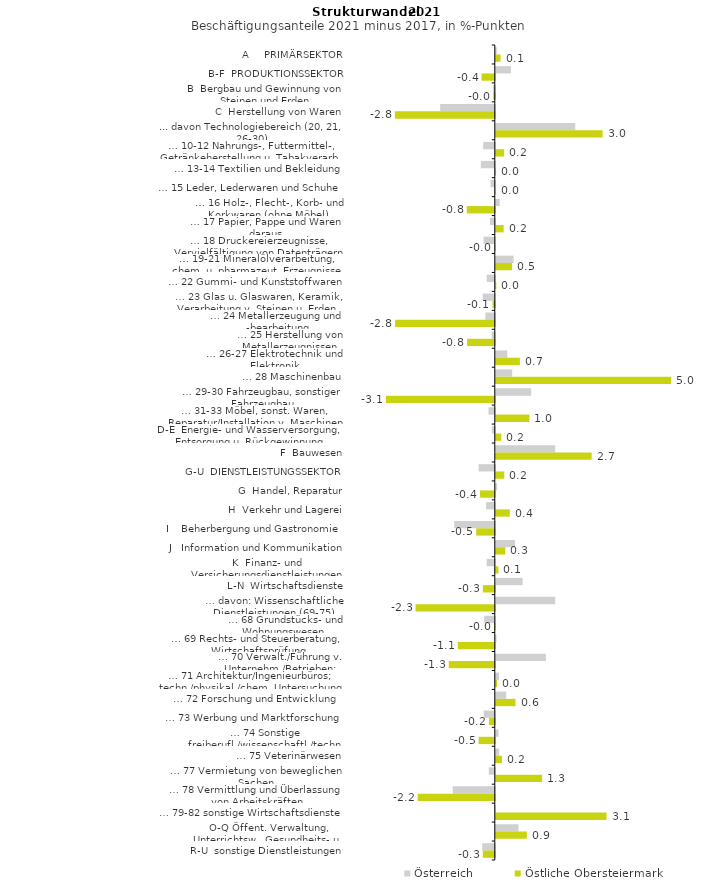
| Category | Österreich | Östliche Obersteiermark |
|---|---|---|
| A     PRIMÄRSEKTOR | 0.029 | 0.136 |
| B-F  PRODUKTIONSSEKTOR | 0.429 | -0.377 |
| B  Bergbau und Gewinnung von Steinen und Erden | -0.054 | -0.045 |
| C  Herstellung von Waren | -1.552 | -2.838 |
| ... davon Technologiebereich (20, 21, 26-30) | 2.256 | 3.035 |
| … 10-12 Nahrungs-, Futtermittel-, Getränkeherstellung u. Tabakverarb. | -0.33 | 0.238 |
| … 13-14 Textilien und Bekleidung | -0.397 | 0.006 |
| … 15 Leder, Lederwaren und Schuhe | -0.119 | 0 |
| … 16 Holz-, Flecht-, Korb- und Korkwaren (ohne Möbel)  | 0.11 | -0.796 |
| … 17 Papier, Pappe und Waren daraus  | -0.136 | 0.223 |
| … 18 Druckereierzeugnisse, Vervielfältigung von Datenträgern | -0.317 | -0.001 |
| … 19-21 Mineralölverarbeitung, chem. u. pharmazeut. Erzeugnisse | 0.503 | 0.463 |
| … 22 Gummi- und Kunststoffwaren | -0.229 | 0.014 |
| … 23 Glas u. Glaswaren, Keramik, Verarbeitung v. Steinen u. Erden  | -0.345 | -0.066 |
| … 24 Metallerzeugung und -bearbeitung | -0.269 | -2.832 |
| … 25 Herstellung von Metallerzeugnissen  | -0.086 | -0.787 |
| … 26-27 Elektrotechnik und Elektronik | 0.325 | 0.684 |
| … 28 Maschinenbau | 0.465 | 4.981 |
| … 29-30 Fahrzeugbau, sonstiger Fahrzeugbau | 1.003 | -3.094 |
| … 31-33 Möbel, sonst. Waren, Reparatur/Installation v. Maschinen | -0.178 | 0.955 |
| D-E  Energie- und Wasserversorgung, Entsorgung u. Rückgewinnung | -0.083 | 0.156 |
| F  Bauwesen | 1.689 | 2.723 |
| G-U  DIENSTLEISTUNGSSEKTOR | -0.458 | 0.241 |
| G  Handel, Reparatur | 0.035 | -0.422 |
| H  Verkehr und Lagerei | -0.247 | 0.398 |
| I    Beherbergung und Gastronomie | -1.152 | -0.528 |
| J   Information und Kommunikation | 0.543 | 0.271 |
| K  Finanz- und Versicherungsdienstleistungen | -0.232 | 0.074 |
| L-N  Wirtschaftsdienste | 0.764 | -0.339 |
| … davon: Wissenschaftliche Dienstleistungen (69-75) | 1.689 | -2.251 |
| … 68 Grundstücks- und Wohnungswesen  | -0.302 | -0.021 |
| … 69 Rechts- und Steuerberatung, Wirtschaftsprüfung | 0.021 | -1.051 |
| … 70 Verwalt./Führung v. Unternehm./Betrieben; Unternehmensberat. | 1.422 | -1.309 |
| … 71 Architektur/Ingenieurbüros; techn./physikal./chem. Untersuchung | 0.093 | 0.035 |
| … 72 Forschung und Entwicklung  | 0.296 | 0.56 |
| … 73 Werbung und Marktforschung | -0.315 | -0.163 |
| … 74 Sonstige freiberufl./wissenschaftl./techn. Tätigkeiten | 0.077 | -0.46 |
| … 75 Veterinärwesen | 0.095 | 0.175 |
| … 77 Vermietung von beweglichen Sachen  | -0.17 | 1.317 |
| … 78 Vermittlung und Überlassung von Arbeitskräften | -1.195 | -2.191 |
| … 79-82 sonstige Wirtschaftsdienste | -0.022 | 3.146 |
| O-Q Öffent. Verwaltung, Unterrichtsw., Gesundheits- u. Sozialwesen | 0.646 | 0.882 |
| R-U  sonstige Dienstleistungen | -0.357 | -0.341 |